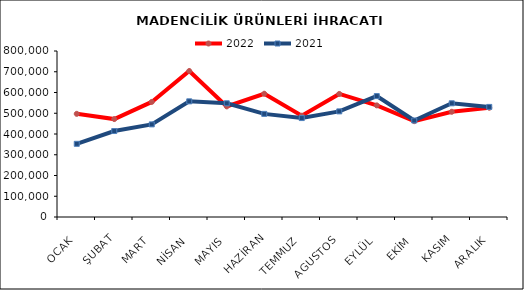
| Category | 2022 | 2021 |
|---|---|---|
| OCAK | 497148.808 | 352707.882 |
| ŞUBAT | 471946.219 | 414333.151 |
| MART | 554600.511 | 446313.926 |
| NİSAN | 703513.77 | 557406.297 |
| MAYIS | 533049.23 | 547954.731 |
| HAZİRAN | 594051.504 | 496926.693 |
| TEMMUZ | 488171.183 | 476806.038 |
| AGUSTOS | 593040.366 | 508970.626 |
| EYLÜL | 537920.485 | 582749.425 |
| EKİM | 461895.51 | 465035.924 |
| KASIM | 507099.173 | 547964.594 |
| ARALIK | 526564.937 | 530527.502 |